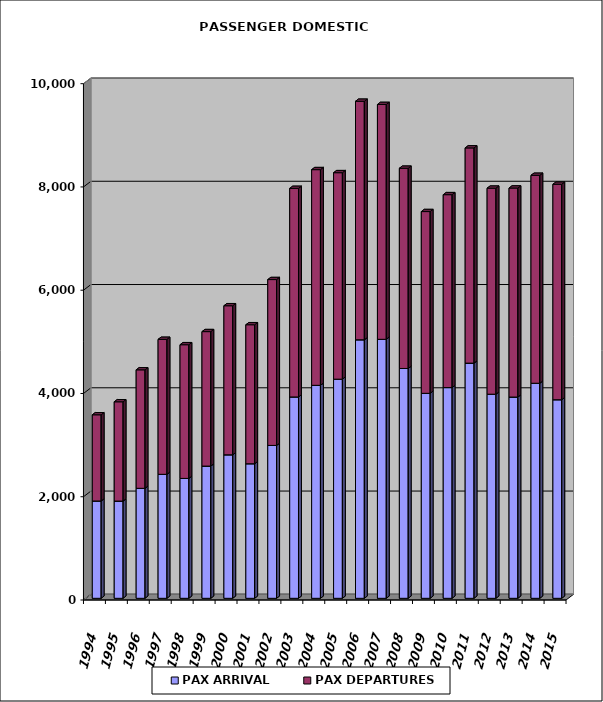
| Category | PAX ARRIVAL | PAX DEPARTURES |
|---|---|---|
| 1994.0 | 1885 | 1669 |
| 1995.0 | 1883 | 1923 |
| 1996.0 | 2130 | 2295 |
| 1997.0 | 2401 | 2614 |
| 1998.0 | 2322 | 2589 |
| 1999.0 | 2561 | 2604 |
| 2000.0 | 2779 | 2887 |
| 2001.0 | 2606 | 2692 |
| 2002.0 | 2961 | 3212 |
| 2003.0 | 3900 | 4039 |
| 2004.0 | 4125 | 4177 |
| 2005.0 | 4244 | 3999 |
| 2006.0 | 5007 | 4619 |
| 2007.0 | 5016 | 4548 |
| 2008.0 | 4451 | 3878 |
| 2009.0 | 3970 | 3520 |
| 2010.0 | 4081 | 3736 |
| 2011.0 | 4555 | 4168 |
| 2012.0 | 3953 | 3990 |
| 2013.0 | 3898 | 4048 |
| 2014.0 | 4165 | 4027 |
| 2015.0 | 3846 | 4173 |